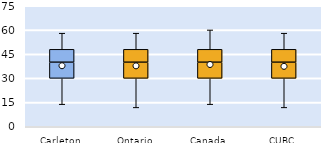
| Category | 25th | 50th | 75th |
|---|---|---|---|
| Carleton | 30 | 10 | 8 |
| Ontario | 30 | 10 | 8 |
| Canada | 30 | 10 | 8 |
| CUBC | 30 | 10 | 8 |